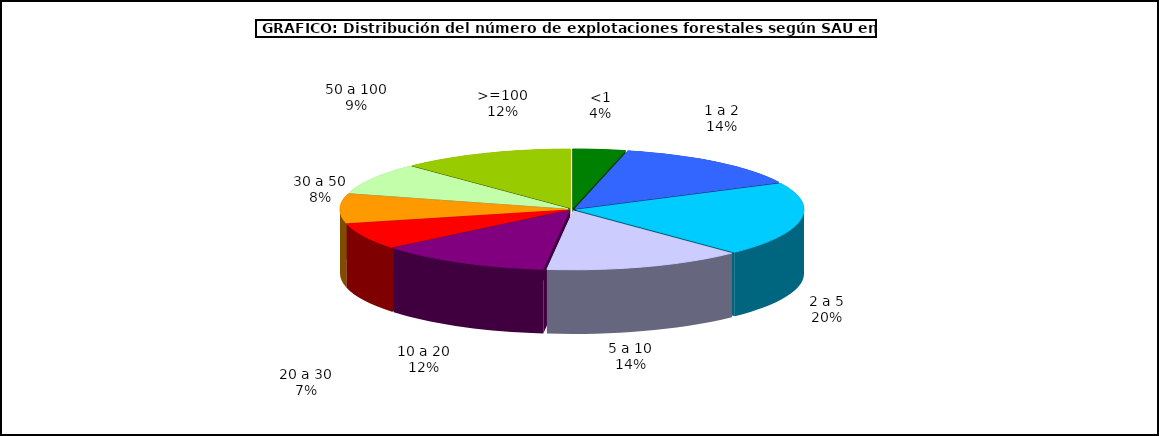
| Category | Series 0 |
|---|---|
| 0 | 7227 |
| 1 | 27026 |
| 2 | 38812 |
| 3 | 27313 |
| 4 | 23639 |
| 5 | 13851 |
| 6 | 15444 |
| 7 | 16477 |
| 8 | 23761 |